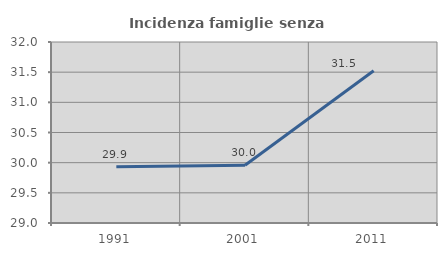
| Category | Incidenza famiglie senza nuclei |
|---|---|
| 1991.0 | 29.934 |
| 2001.0 | 29.957 |
| 2011.0 | 31.525 |